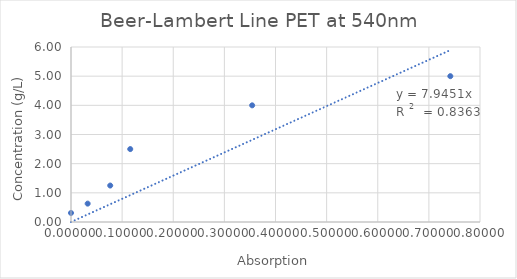
| Category | Beerl-Lambert Line PET at 540nm |
|---|---|
| 0.0 | 0.31 |
| 0.03260733797966996 | 0.63 |
| 0.07671910854719918 | 1.25 |
| 0.11587123250934749 | 2.5 |
| 0.35434619092527986 | 4 |
| 0.7419619243726757 | 5 |